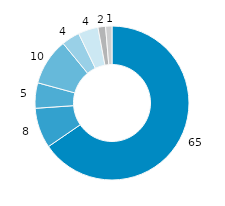
| Category | Thüringen |
|---|---|
| 0 | 65.43 |
| 1 | 8.464 |
| 2 | 5.329 |
| 3 | 9.831 |
| 4 | 3.825 |
| 5 | 4.181 |
| 6 | 1.596 |
| 7 | 1.332 |